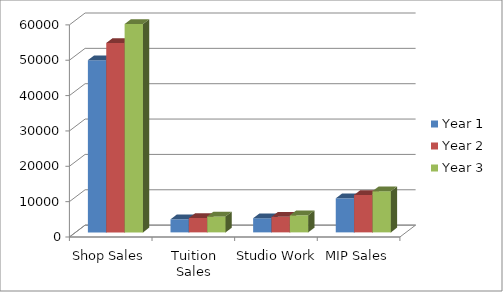
| Category | Year 1 | Year 2 | Year 3 |
|---|---|---|---|
| Shop Sales | 48708 | 53580 | 58932 |
| Tuition Sales | 3696 | 4068 | 4524 |
| Studio Work | 4000 | 4404 | 4836 |
| MIP Sales | 9636 | 10596 | 11652 |